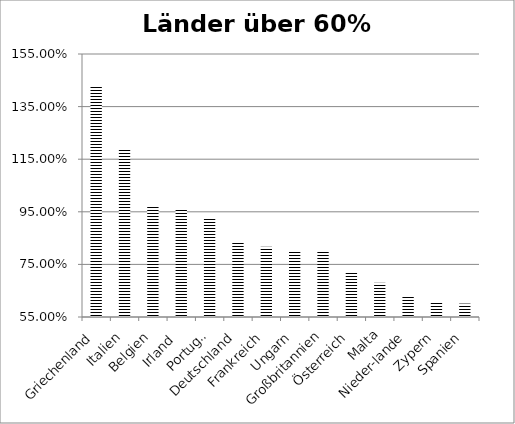
| Category | Series 0 |
|---|---|
| Griechenland | 1.428 |
| Italien | 1.19 |
| Belgien | 0.968 |
| Irland  | 0.962 |
| Portugal | 0.93 |
| Deutschland | 0.832 |
| Frankreich | 0.817 |
| Ungarn | 0.802 |
| Großbritannien | 0.8 |
| Österreich | 0.723 |
| Malta | 0.68 |
| Nieder­lande | 0.627 |
| Zypern | 0.608 |
| Spanien | 0.601 |